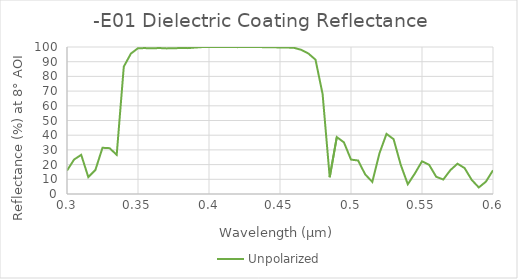
| Category | Unpolarized |
|---|---|
| 0.3 | 15.912 |
| 0.305 | 23.452 |
| 0.31 | 26.664 |
| 0.315 | 11.498 |
| 0.32 | 16.348 |
| 0.325 | 31.447 |
| 0.33 | 31.171 |
| 0.335 | 26.649 |
| 0.34 | 86.655 |
| 0.345 | 95.499 |
| 0.35 | 99.196 |
| 0.355 | 99.25 |
| 0.36 | 99.105 |
| 0.365 | 99.299 |
| 0.37 | 99.055 |
| 0.375 | 99.121 |
| 0.38 | 99.335 |
| 0.385 | 99.231 |
| 0.39 | 99.618 |
| 0.395 | 99.928 |
| 0.4 | 99.946 |
| 0.405 | 99.963 |
| 0.41 | 99.996 |
| 0.415 | 100 |
| 0.42 | 99.91 |
| 0.425 | 99.996 |
| 0.43 | 99.967 |
| 0.435 | 99.962 |
| 0.44 | 99.856 |
| 0.445 | 99.787 |
| 0.45 | 99.703 |
| 0.455 | 99.645 |
| 0.46 | 99.401 |
| 0.465 | 98.072 |
| 0.47 | 95.563 |
| 0.475 | 91.378 |
| 0.48 | 67.996 |
| 0.485 | 11.421 |
| 0.49 | 38.707 |
| 0.495 | 35.157 |
| 0.5 | 23.411 |
| 0.505 | 22.772 |
| 0.51 | 13.312 |
| 0.515 | 8.236 |
| 0.52 | 27.586 |
| 0.525 | 40.892 |
| 0.53 | 37.308 |
| 0.535 | 19.935 |
| 0.54 | 6.624 |
| 0.545 | 13.99 |
| 0.55 | 22.235 |
| 0.555 | 19.897 |
| 0.56 | 11.708 |
| 0.565 | 9.857 |
| 0.57 | 16.246 |
| 0.575 | 20.604 |
| 0.58 | 17.642 |
| 0.585 | 9.606 |
| 0.59 | 4.445 |
| 0.595 | 8.386 |
| 0.6 | 16.139 |